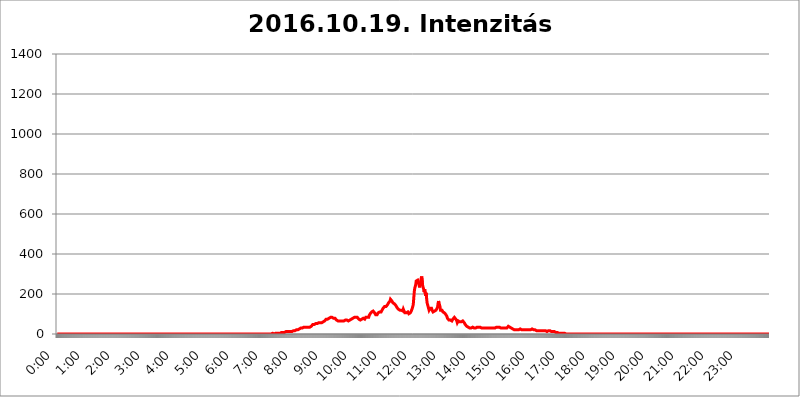
| Category | 2016.10.19. Intenzitás [W/m^2] |
|---|---|
| 0.0 | 0 |
| 0.0006944444444444445 | 0 |
| 0.001388888888888889 | 0 |
| 0.0020833333333333333 | 0 |
| 0.002777777777777778 | 0 |
| 0.003472222222222222 | 0 |
| 0.004166666666666667 | 0 |
| 0.004861111111111111 | 0 |
| 0.005555555555555556 | 0 |
| 0.0062499999999999995 | 0 |
| 0.006944444444444444 | 0 |
| 0.007638888888888889 | 0 |
| 0.008333333333333333 | 0 |
| 0.009027777777777779 | 0 |
| 0.009722222222222222 | 0 |
| 0.010416666666666666 | 0 |
| 0.011111111111111112 | 0 |
| 0.011805555555555555 | 0 |
| 0.012499999999999999 | 0 |
| 0.013194444444444444 | 0 |
| 0.013888888888888888 | 0 |
| 0.014583333333333332 | 0 |
| 0.015277777777777777 | 0 |
| 0.015972222222222224 | 0 |
| 0.016666666666666666 | 0 |
| 0.017361111111111112 | 0 |
| 0.018055555555555557 | 0 |
| 0.01875 | 0 |
| 0.019444444444444445 | 0 |
| 0.02013888888888889 | 0 |
| 0.020833333333333332 | 0 |
| 0.02152777777777778 | 0 |
| 0.022222222222222223 | 0 |
| 0.02291666666666667 | 0 |
| 0.02361111111111111 | 0 |
| 0.024305555555555556 | 0 |
| 0.024999999999999998 | 0 |
| 0.025694444444444447 | 0 |
| 0.02638888888888889 | 0 |
| 0.027083333333333334 | 0 |
| 0.027777777777777776 | 0 |
| 0.02847222222222222 | 0 |
| 0.029166666666666664 | 0 |
| 0.029861111111111113 | 0 |
| 0.030555555555555555 | 0 |
| 0.03125 | 0 |
| 0.03194444444444445 | 0 |
| 0.03263888888888889 | 0 |
| 0.03333333333333333 | 0 |
| 0.034027777777777775 | 0 |
| 0.034722222222222224 | 0 |
| 0.035416666666666666 | 0 |
| 0.036111111111111115 | 0 |
| 0.03680555555555556 | 0 |
| 0.0375 | 0 |
| 0.03819444444444444 | 0 |
| 0.03888888888888889 | 0 |
| 0.03958333333333333 | 0 |
| 0.04027777777777778 | 0 |
| 0.04097222222222222 | 0 |
| 0.041666666666666664 | 0 |
| 0.042361111111111106 | 0 |
| 0.04305555555555556 | 0 |
| 0.043750000000000004 | 0 |
| 0.044444444444444446 | 0 |
| 0.04513888888888889 | 0 |
| 0.04583333333333334 | 0 |
| 0.04652777777777778 | 0 |
| 0.04722222222222222 | 0 |
| 0.04791666666666666 | 0 |
| 0.04861111111111111 | 0 |
| 0.049305555555555554 | 0 |
| 0.049999999999999996 | 0 |
| 0.05069444444444445 | 0 |
| 0.051388888888888894 | 0 |
| 0.052083333333333336 | 0 |
| 0.05277777777777778 | 0 |
| 0.05347222222222222 | 0 |
| 0.05416666666666667 | 0 |
| 0.05486111111111111 | 0 |
| 0.05555555555555555 | 0 |
| 0.05625 | 0 |
| 0.05694444444444444 | 0 |
| 0.057638888888888885 | 0 |
| 0.05833333333333333 | 0 |
| 0.05902777777777778 | 0 |
| 0.059722222222222225 | 0 |
| 0.06041666666666667 | 0 |
| 0.061111111111111116 | 0 |
| 0.06180555555555556 | 0 |
| 0.0625 | 0 |
| 0.06319444444444444 | 0 |
| 0.06388888888888888 | 0 |
| 0.06458333333333334 | 0 |
| 0.06527777777777778 | 0 |
| 0.06597222222222222 | 0 |
| 0.06666666666666667 | 0 |
| 0.06736111111111111 | 0 |
| 0.06805555555555555 | 0 |
| 0.06874999999999999 | 0 |
| 0.06944444444444443 | 0 |
| 0.07013888888888889 | 0 |
| 0.07083333333333333 | 0 |
| 0.07152777777777779 | 0 |
| 0.07222222222222223 | 0 |
| 0.07291666666666667 | 0 |
| 0.07361111111111111 | 0 |
| 0.07430555555555556 | 0 |
| 0.075 | 0 |
| 0.07569444444444444 | 0 |
| 0.0763888888888889 | 0 |
| 0.07708333333333334 | 0 |
| 0.07777777777777778 | 0 |
| 0.07847222222222222 | 0 |
| 0.07916666666666666 | 0 |
| 0.0798611111111111 | 0 |
| 0.08055555555555556 | 0 |
| 0.08125 | 0 |
| 0.08194444444444444 | 0 |
| 0.08263888888888889 | 0 |
| 0.08333333333333333 | 0 |
| 0.08402777777777777 | 0 |
| 0.08472222222222221 | 0 |
| 0.08541666666666665 | 0 |
| 0.08611111111111112 | 0 |
| 0.08680555555555557 | 0 |
| 0.08750000000000001 | 0 |
| 0.08819444444444445 | 0 |
| 0.08888888888888889 | 0 |
| 0.08958333333333333 | 0 |
| 0.09027777777777778 | 0 |
| 0.09097222222222222 | 0 |
| 0.09166666666666667 | 0 |
| 0.09236111111111112 | 0 |
| 0.09305555555555556 | 0 |
| 0.09375 | 0 |
| 0.09444444444444444 | 0 |
| 0.09513888888888888 | 0 |
| 0.09583333333333333 | 0 |
| 0.09652777777777777 | 0 |
| 0.09722222222222222 | 0 |
| 0.09791666666666667 | 0 |
| 0.09861111111111111 | 0 |
| 0.09930555555555555 | 0 |
| 0.09999999999999999 | 0 |
| 0.10069444444444443 | 0 |
| 0.1013888888888889 | 0 |
| 0.10208333333333335 | 0 |
| 0.10277777777777779 | 0 |
| 0.10347222222222223 | 0 |
| 0.10416666666666667 | 0 |
| 0.10486111111111111 | 0 |
| 0.10555555555555556 | 0 |
| 0.10625 | 0 |
| 0.10694444444444444 | 0 |
| 0.1076388888888889 | 0 |
| 0.10833333333333334 | 0 |
| 0.10902777777777778 | 0 |
| 0.10972222222222222 | 0 |
| 0.1111111111111111 | 0 |
| 0.11180555555555556 | 0 |
| 0.11180555555555556 | 0 |
| 0.1125 | 0 |
| 0.11319444444444444 | 0 |
| 0.11388888888888889 | 0 |
| 0.11458333333333333 | 0 |
| 0.11527777777777777 | 0 |
| 0.11597222222222221 | 0 |
| 0.11666666666666665 | 0 |
| 0.1173611111111111 | 0 |
| 0.11805555555555557 | 0 |
| 0.11944444444444445 | 0 |
| 0.12013888888888889 | 0 |
| 0.12083333333333333 | 0 |
| 0.12152777777777778 | 0 |
| 0.12222222222222223 | 0 |
| 0.12291666666666667 | 0 |
| 0.12291666666666667 | 0 |
| 0.12361111111111112 | 0 |
| 0.12430555555555556 | 0 |
| 0.125 | 0 |
| 0.12569444444444444 | 0 |
| 0.12638888888888888 | 0 |
| 0.12708333333333333 | 0 |
| 0.16875 | 0 |
| 0.12847222222222224 | 0 |
| 0.12916666666666668 | 0 |
| 0.12986111111111112 | 0 |
| 0.13055555555555556 | 0 |
| 0.13125 | 0 |
| 0.13194444444444445 | 0 |
| 0.1326388888888889 | 0 |
| 0.13333333333333333 | 0 |
| 0.13402777777777777 | 0 |
| 0.13402777777777777 | 0 |
| 0.13472222222222222 | 0 |
| 0.13541666666666666 | 0 |
| 0.1361111111111111 | 0 |
| 0.13749999999999998 | 0 |
| 0.13819444444444443 | 0 |
| 0.1388888888888889 | 0 |
| 0.13958333333333334 | 0 |
| 0.14027777777777778 | 0 |
| 0.14097222222222222 | 0 |
| 0.14166666666666666 | 0 |
| 0.1423611111111111 | 0 |
| 0.14305555555555557 | 0 |
| 0.14375000000000002 | 0 |
| 0.14444444444444446 | 0 |
| 0.1451388888888889 | 0 |
| 0.1451388888888889 | 0 |
| 0.14652777777777778 | 0 |
| 0.14722222222222223 | 0 |
| 0.14791666666666667 | 0 |
| 0.1486111111111111 | 0 |
| 0.14930555555555555 | 0 |
| 0.15 | 0 |
| 0.15069444444444444 | 0 |
| 0.15138888888888888 | 0 |
| 0.15208333333333332 | 0 |
| 0.15277777777777776 | 0 |
| 0.15347222222222223 | 0 |
| 0.15416666666666667 | 0 |
| 0.15486111111111112 | 0 |
| 0.15555555555555556 | 0 |
| 0.15625 | 0 |
| 0.15694444444444444 | 0 |
| 0.15763888888888888 | 0 |
| 0.15833333333333333 | 0 |
| 0.15902777777777777 | 0 |
| 0.15972222222222224 | 0 |
| 0.16041666666666668 | 0 |
| 0.16111111111111112 | 0 |
| 0.16180555555555556 | 0 |
| 0.1625 | 0 |
| 0.16319444444444445 | 0 |
| 0.1638888888888889 | 0 |
| 0.16458333333333333 | 0 |
| 0.16527777777777777 | 0 |
| 0.16597222222222222 | 0 |
| 0.16666666666666666 | 0 |
| 0.1673611111111111 | 0 |
| 0.16805555555555554 | 0 |
| 0.16874999999999998 | 0 |
| 0.16944444444444443 | 0 |
| 0.17013888888888887 | 0 |
| 0.1708333333333333 | 0 |
| 0.17152777777777775 | 0 |
| 0.17222222222222225 | 0 |
| 0.1729166666666667 | 0 |
| 0.17361111111111113 | 0 |
| 0.17430555555555557 | 0 |
| 0.17500000000000002 | 0 |
| 0.17569444444444446 | 0 |
| 0.1763888888888889 | 0 |
| 0.17708333333333334 | 0 |
| 0.17777777777777778 | 0 |
| 0.17847222222222223 | 0 |
| 0.17916666666666667 | 0 |
| 0.1798611111111111 | 0 |
| 0.18055555555555555 | 0 |
| 0.18125 | 0 |
| 0.18194444444444444 | 0 |
| 0.1826388888888889 | 0 |
| 0.18333333333333335 | 0 |
| 0.1840277777777778 | 0 |
| 0.18472222222222223 | 0 |
| 0.18541666666666667 | 0 |
| 0.18611111111111112 | 0 |
| 0.18680555555555556 | 0 |
| 0.1875 | 0 |
| 0.18819444444444444 | 0 |
| 0.18888888888888888 | 0 |
| 0.18958333333333333 | 0 |
| 0.19027777777777777 | 0 |
| 0.1909722222222222 | 0 |
| 0.19166666666666665 | 0 |
| 0.19236111111111112 | 0 |
| 0.19305555555555554 | 0 |
| 0.19375 | 0 |
| 0.19444444444444445 | 0 |
| 0.1951388888888889 | 0 |
| 0.19583333333333333 | 0 |
| 0.19652777777777777 | 0 |
| 0.19722222222222222 | 0 |
| 0.19791666666666666 | 0 |
| 0.1986111111111111 | 0 |
| 0.19930555555555554 | 0 |
| 0.19999999999999998 | 0 |
| 0.20069444444444443 | 0 |
| 0.20138888888888887 | 0 |
| 0.2020833333333333 | 0 |
| 0.2027777777777778 | 0 |
| 0.2034722222222222 | 0 |
| 0.2041666666666667 | 0 |
| 0.20486111111111113 | 0 |
| 0.20555555555555557 | 0 |
| 0.20625000000000002 | 0 |
| 0.20694444444444446 | 0 |
| 0.2076388888888889 | 0 |
| 0.20833333333333334 | 0 |
| 0.20902777777777778 | 0 |
| 0.20972222222222223 | 0 |
| 0.21041666666666667 | 0 |
| 0.2111111111111111 | 0 |
| 0.21180555555555555 | 0 |
| 0.2125 | 0 |
| 0.21319444444444444 | 0 |
| 0.2138888888888889 | 0 |
| 0.21458333333333335 | 0 |
| 0.2152777777777778 | 0 |
| 0.21597222222222223 | 0 |
| 0.21666666666666667 | 0 |
| 0.21736111111111112 | 0 |
| 0.21805555555555556 | 0 |
| 0.21875 | 0 |
| 0.21944444444444444 | 0 |
| 0.22013888888888888 | 0 |
| 0.22083333333333333 | 0 |
| 0.22152777777777777 | 0 |
| 0.2222222222222222 | 0 |
| 0.22291666666666665 | 0 |
| 0.2236111111111111 | 0 |
| 0.22430555555555556 | 0 |
| 0.225 | 0 |
| 0.22569444444444445 | 0 |
| 0.2263888888888889 | 0 |
| 0.22708333333333333 | 0 |
| 0.22777777777777777 | 0 |
| 0.22847222222222222 | 0 |
| 0.22916666666666666 | 0 |
| 0.2298611111111111 | 0 |
| 0.23055555555555554 | 0 |
| 0.23124999999999998 | 0 |
| 0.23194444444444443 | 0 |
| 0.23263888888888887 | 0 |
| 0.2333333333333333 | 0 |
| 0.2340277777777778 | 0 |
| 0.2347222222222222 | 0 |
| 0.2354166666666667 | 0 |
| 0.23611111111111113 | 0 |
| 0.23680555555555557 | 0 |
| 0.23750000000000002 | 0 |
| 0.23819444444444446 | 0 |
| 0.2388888888888889 | 0 |
| 0.23958333333333334 | 0 |
| 0.24027777777777778 | 0 |
| 0.24097222222222223 | 0 |
| 0.24166666666666667 | 0 |
| 0.2423611111111111 | 0 |
| 0.24305555555555555 | 0 |
| 0.24375 | 0 |
| 0.24444444444444446 | 0 |
| 0.24513888888888888 | 0 |
| 0.24583333333333335 | 0 |
| 0.2465277777777778 | 0 |
| 0.24722222222222223 | 0 |
| 0.24791666666666667 | 0 |
| 0.24861111111111112 | 0 |
| 0.24930555555555556 | 0 |
| 0.25 | 0 |
| 0.25069444444444444 | 0 |
| 0.2513888888888889 | 0 |
| 0.2520833333333333 | 0 |
| 0.25277777777777777 | 0 |
| 0.2534722222222222 | 0 |
| 0.25416666666666665 | 0 |
| 0.2548611111111111 | 0 |
| 0.2555555555555556 | 0 |
| 0.25625000000000003 | 0 |
| 0.2569444444444445 | 0 |
| 0.2576388888888889 | 0 |
| 0.25833333333333336 | 0 |
| 0.2590277777777778 | 0 |
| 0.25972222222222224 | 0 |
| 0.2604166666666667 | 0 |
| 0.2611111111111111 | 0 |
| 0.26180555555555557 | 0 |
| 0.2625 | 0 |
| 0.26319444444444445 | 0 |
| 0.2638888888888889 | 0 |
| 0.26458333333333334 | 0 |
| 0.2652777777777778 | 0 |
| 0.2659722222222222 | 0 |
| 0.26666666666666666 | 0 |
| 0.2673611111111111 | 0 |
| 0.26805555555555555 | 0 |
| 0.26875 | 0 |
| 0.26944444444444443 | 0 |
| 0.2701388888888889 | 0 |
| 0.2708333333333333 | 0 |
| 0.27152777777777776 | 0 |
| 0.2722222222222222 | 0 |
| 0.27291666666666664 | 0 |
| 0.2736111111111111 | 0 |
| 0.2743055555555555 | 0 |
| 0.27499999999999997 | 0 |
| 0.27569444444444446 | 0 |
| 0.27638888888888885 | 0 |
| 0.27708333333333335 | 0 |
| 0.2777777777777778 | 0 |
| 0.27847222222222223 | 0 |
| 0.2791666666666667 | 0 |
| 0.2798611111111111 | 0 |
| 0.28055555555555556 | 0 |
| 0.28125 | 0 |
| 0.28194444444444444 | 0 |
| 0.2826388888888889 | 0 |
| 0.2833333333333333 | 0 |
| 0.28402777777777777 | 0 |
| 0.2847222222222222 | 0 |
| 0.28541666666666665 | 0 |
| 0.28611111111111115 | 0 |
| 0.28680555555555554 | 0 |
| 0.28750000000000003 | 0 |
| 0.2881944444444445 | 0 |
| 0.2888888888888889 | 0 |
| 0.28958333333333336 | 0 |
| 0.2902777777777778 | 0 |
| 0.29097222222222224 | 0 |
| 0.2916666666666667 | 0 |
| 0.2923611111111111 | 0 |
| 0.29305555555555557 | 0 |
| 0.29375 | 0 |
| 0.29444444444444445 | 0 |
| 0.2951388888888889 | 0 |
| 0.29583333333333334 | 0 |
| 0.2965277777777778 | 0 |
| 0.2972222222222222 | 0 |
| 0.29791666666666666 | 0 |
| 0.2986111111111111 | 0 |
| 0.29930555555555555 | 0 |
| 0.3 | 0 |
| 0.30069444444444443 | 0 |
| 0.3013888888888889 | 3.525 |
| 0.3020833333333333 | 3.525 |
| 0.30277777777777776 | 3.525 |
| 0.3034722222222222 | 0 |
| 0.30416666666666664 | 0 |
| 0.3048611111111111 | 3.525 |
| 0.3055555555555555 | 3.525 |
| 0.30624999999999997 | 3.525 |
| 0.3069444444444444 | 3.525 |
| 0.3076388888888889 | 3.525 |
| 0.30833333333333335 | 3.525 |
| 0.3090277777777778 | 3.525 |
| 0.30972222222222223 | 3.525 |
| 0.3104166666666667 | 3.525 |
| 0.3111111111111111 | 3.525 |
| 0.31180555555555556 | 3.525 |
| 0.3125 | 3.525 |
| 0.31319444444444444 | 3.525 |
| 0.3138888888888889 | 3.525 |
| 0.3145833333333333 | 7.887 |
| 0.31527777777777777 | 7.887 |
| 0.3159722222222222 | 7.887 |
| 0.31666666666666665 | 7.887 |
| 0.31736111111111115 | 7.887 |
| 0.31805555555555554 | 7.887 |
| 0.31875000000000003 | 7.887 |
| 0.3194444444444445 | 7.887 |
| 0.3201388888888889 | 12.257 |
| 0.32083333333333336 | 12.257 |
| 0.3215277777777778 | 12.257 |
| 0.32222222222222224 | 12.257 |
| 0.3229166666666667 | 12.257 |
| 0.3236111111111111 | 12.257 |
| 0.32430555555555557 | 12.257 |
| 0.325 | 12.257 |
| 0.32569444444444445 | 12.257 |
| 0.3263888888888889 | 12.257 |
| 0.32708333333333334 | 12.257 |
| 0.3277777777777778 | 12.257 |
| 0.3284722222222222 | 12.257 |
| 0.32916666666666666 | 12.257 |
| 0.3298611111111111 | 12.257 |
| 0.33055555555555555 | 16.636 |
| 0.33125 | 16.636 |
| 0.33194444444444443 | 16.636 |
| 0.3326388888888889 | 16.636 |
| 0.3333333333333333 | 16.636 |
| 0.3340277777777778 | 16.636 |
| 0.3347222222222222 | 21.024 |
| 0.3354166666666667 | 21.024 |
| 0.3361111111111111 | 21.024 |
| 0.3368055555555556 | 21.024 |
| 0.33749999999999997 | 21.024 |
| 0.33819444444444446 | 25.419 |
| 0.33888888888888885 | 25.419 |
| 0.33958333333333335 | 25.419 |
| 0.34027777777777773 | 25.419 |
| 0.34097222222222223 | 25.419 |
| 0.3416666666666666 | 29.823 |
| 0.3423611111111111 | 29.823 |
| 0.3430555555555555 | 29.823 |
| 0.34375 | 29.823 |
| 0.3444444444444445 | 29.823 |
| 0.3451388888888889 | 34.234 |
| 0.3458333333333334 | 34.234 |
| 0.34652777777777777 | 34.234 |
| 0.34722222222222227 | 34.234 |
| 0.34791666666666665 | 34.234 |
| 0.34861111111111115 | 34.234 |
| 0.34930555555555554 | 34.234 |
| 0.35000000000000003 | 34.234 |
| 0.3506944444444444 | 34.234 |
| 0.3513888888888889 | 34.234 |
| 0.3520833333333333 | 34.234 |
| 0.3527777777777778 | 34.234 |
| 0.3534722222222222 | 34.234 |
| 0.3541666666666667 | 34.234 |
| 0.3548611111111111 | 34.234 |
| 0.35555555555555557 | 38.653 |
| 0.35625 | 38.653 |
| 0.35694444444444445 | 43.079 |
| 0.3576388888888889 | 43.079 |
| 0.35833333333333334 | 47.511 |
| 0.3590277777777778 | 47.511 |
| 0.3597222222222222 | 47.511 |
| 0.36041666666666666 | 47.511 |
| 0.3611111111111111 | 47.511 |
| 0.36180555555555555 | 51.951 |
| 0.3625 | 51.951 |
| 0.36319444444444443 | 51.951 |
| 0.3638888888888889 | 51.951 |
| 0.3645833333333333 | 51.951 |
| 0.3652777777777778 | 51.951 |
| 0.3659722222222222 | 56.398 |
| 0.3666666666666667 | 56.398 |
| 0.3673611111111111 | 56.398 |
| 0.3680555555555556 | 56.398 |
| 0.36874999999999997 | 56.398 |
| 0.36944444444444446 | 56.398 |
| 0.37013888888888885 | 56.398 |
| 0.37083333333333335 | 56.398 |
| 0.37152777777777773 | 56.398 |
| 0.37222222222222223 | 56.398 |
| 0.3729166666666666 | 60.85 |
| 0.3736111111111111 | 60.85 |
| 0.3743055555555555 | 65.31 |
| 0.375 | 65.31 |
| 0.3756944444444445 | 69.775 |
| 0.3763888888888889 | 69.775 |
| 0.3770833333333334 | 74.246 |
| 0.37777777777777777 | 74.246 |
| 0.37847222222222227 | 74.246 |
| 0.37916666666666665 | 74.246 |
| 0.37986111111111115 | 74.246 |
| 0.38055555555555554 | 78.722 |
| 0.38125000000000003 | 78.722 |
| 0.3819444444444444 | 78.722 |
| 0.3826388888888889 | 78.722 |
| 0.3833333333333333 | 83.205 |
| 0.3840277777777778 | 83.205 |
| 0.3847222222222222 | 83.205 |
| 0.3854166666666667 | 83.205 |
| 0.3861111111111111 | 83.205 |
| 0.38680555555555557 | 83.205 |
| 0.3875 | 78.722 |
| 0.38819444444444445 | 78.722 |
| 0.3888888888888889 | 78.722 |
| 0.38958333333333334 | 78.722 |
| 0.3902777777777778 | 74.246 |
| 0.3909722222222222 | 74.246 |
| 0.39166666666666666 | 69.775 |
| 0.3923611111111111 | 69.775 |
| 0.39305555555555555 | 65.31 |
| 0.39375 | 65.31 |
| 0.39444444444444443 | 65.31 |
| 0.3951388888888889 | 65.31 |
| 0.3958333333333333 | 65.31 |
| 0.3965277777777778 | 65.31 |
| 0.3972222222222222 | 65.31 |
| 0.3979166666666667 | 65.31 |
| 0.3986111111111111 | 65.31 |
| 0.3993055555555556 | 65.31 |
| 0.39999999999999997 | 65.31 |
| 0.40069444444444446 | 65.31 |
| 0.40138888888888885 | 65.31 |
| 0.40208333333333335 | 65.31 |
| 0.40277777777777773 | 65.31 |
| 0.40347222222222223 | 65.31 |
| 0.4041666666666666 | 69.775 |
| 0.4048611111111111 | 69.775 |
| 0.4055555555555555 | 69.775 |
| 0.40625 | 69.775 |
| 0.4069444444444445 | 65.31 |
| 0.4076388888888889 | 65.31 |
| 0.4083333333333334 | 65.31 |
| 0.40902777777777777 | 65.31 |
| 0.40972222222222227 | 65.31 |
| 0.41041666666666665 | 69.775 |
| 0.41111111111111115 | 69.775 |
| 0.41180555555555554 | 74.246 |
| 0.41250000000000003 | 74.246 |
| 0.4131944444444444 | 74.246 |
| 0.4138888888888889 | 78.722 |
| 0.4145833333333333 | 78.722 |
| 0.4152777777777778 | 78.722 |
| 0.4159722222222222 | 78.722 |
| 0.4166666666666667 | 83.205 |
| 0.4173611111111111 | 83.205 |
| 0.41805555555555557 | 83.205 |
| 0.41875 | 83.205 |
| 0.41944444444444445 | 83.205 |
| 0.4201388888888889 | 83.205 |
| 0.42083333333333334 | 83.205 |
| 0.4215277777777778 | 78.722 |
| 0.4222222222222222 | 78.722 |
| 0.42291666666666666 | 74.246 |
| 0.4236111111111111 | 69.775 |
| 0.42430555555555555 | 69.775 |
| 0.425 | 69.775 |
| 0.42569444444444443 | 74.246 |
| 0.4263888888888889 | 74.246 |
| 0.4270833333333333 | 74.246 |
| 0.4277777777777778 | 74.246 |
| 0.4284722222222222 | 74.246 |
| 0.4291666666666667 | 78.722 |
| 0.4298611111111111 | 78.722 |
| 0.4305555555555556 | 74.246 |
| 0.43124999999999997 | 74.246 |
| 0.43194444444444446 | 78.722 |
| 0.43263888888888885 | 83.205 |
| 0.43333333333333335 | 87.692 |
| 0.43402777777777773 | 87.692 |
| 0.43472222222222223 | 83.205 |
| 0.4354166666666666 | 83.205 |
| 0.4361111111111111 | 83.205 |
| 0.4368055555555555 | 83.205 |
| 0.4375 | 92.184 |
| 0.4381944444444445 | 96.682 |
| 0.4388888888888889 | 101.184 |
| 0.4395833333333334 | 101.184 |
| 0.44027777777777777 | 105.69 |
| 0.44097222222222227 | 110.201 |
| 0.44166666666666665 | 110.201 |
| 0.44236111111111115 | 110.201 |
| 0.44305555555555554 | 114.716 |
| 0.44375000000000003 | 114.716 |
| 0.4444444444444444 | 110.201 |
| 0.4451388888888889 | 105.69 |
| 0.4458333333333333 | 101.184 |
| 0.4465277777777778 | 96.682 |
| 0.4472222222222222 | 96.682 |
| 0.4479166666666667 | 96.682 |
| 0.4486111111111111 | 96.682 |
| 0.44930555555555557 | 101.184 |
| 0.45 | 105.69 |
| 0.45069444444444445 | 110.201 |
| 0.4513888888888889 | 110.201 |
| 0.45208333333333334 | 110.201 |
| 0.4527777777777778 | 105.69 |
| 0.4534722222222222 | 105.69 |
| 0.45416666666666666 | 110.201 |
| 0.4548611111111111 | 114.716 |
| 0.45555555555555555 | 119.235 |
| 0.45625 | 123.758 |
| 0.45694444444444443 | 128.284 |
| 0.4576388888888889 | 132.814 |
| 0.4583333333333333 | 132.814 |
| 0.4590277777777778 | 137.347 |
| 0.4597222222222222 | 137.347 |
| 0.4604166666666667 | 137.347 |
| 0.4611111111111111 | 137.347 |
| 0.4618055555555556 | 137.347 |
| 0.46249999999999997 | 141.884 |
| 0.46319444444444446 | 146.423 |
| 0.46388888888888885 | 150.964 |
| 0.46458333333333335 | 155.509 |
| 0.46527777777777773 | 155.509 |
| 0.46597222222222223 | 160.056 |
| 0.4666666666666666 | 164.605 |
| 0.4673611111111111 | 173.709 |
| 0.4680555555555555 | 173.709 |
| 0.46875 | 173.709 |
| 0.4694444444444445 | 164.605 |
| 0.4701388888888889 | 160.056 |
| 0.4708333333333334 | 155.509 |
| 0.47152777777777777 | 155.509 |
| 0.47222222222222227 | 155.509 |
| 0.47291666666666665 | 150.964 |
| 0.47361111111111115 | 150.964 |
| 0.47430555555555554 | 146.423 |
| 0.47500000000000003 | 141.884 |
| 0.4756944444444444 | 137.347 |
| 0.4763888888888889 | 132.814 |
| 0.4770833333333333 | 128.284 |
| 0.4777777777777778 | 128.284 |
| 0.4784722222222222 | 123.758 |
| 0.4791666666666667 | 123.758 |
| 0.4798611111111111 | 119.235 |
| 0.48055555555555557 | 119.235 |
| 0.48125 | 123.758 |
| 0.48194444444444445 | 123.758 |
| 0.4826388888888889 | 119.235 |
| 0.48333333333333334 | 119.235 |
| 0.4840277777777778 | 119.235 |
| 0.4847222222222222 | 114.716 |
| 0.48541666666666666 | 123.758 |
| 0.4861111111111111 | 123.758 |
| 0.48680555555555555 | 119.235 |
| 0.4875 | 105.69 |
| 0.48819444444444443 | 101.184 |
| 0.4888888888888889 | 105.69 |
| 0.4895833333333333 | 105.69 |
| 0.4902777777777778 | 105.69 |
| 0.4909722222222222 | 110.201 |
| 0.4916666666666667 | 110.201 |
| 0.4923611111111111 | 105.69 |
| 0.4930555555555556 | 101.184 |
| 0.49374999999999997 | 101.184 |
| 0.49444444444444446 | 105.69 |
| 0.49513888888888885 | 105.69 |
| 0.49583333333333335 | 110.201 |
| 0.49652777777777773 | 114.716 |
| 0.49722222222222223 | 119.235 |
| 0.4979166666666666 | 128.284 |
| 0.4986111111111111 | 132.814 |
| 0.4993055555555555 | 146.423 |
| 0.5 | 178.264 |
| 0.5006944444444444 | 210.182 |
| 0.5013888888888889 | 228.436 |
| 0.5020833333333333 | 237.564 |
| 0.5027777777777778 | 246.689 |
| 0.5034722222222222 | 264.932 |
| 0.5041666666666667 | 269.49 |
| 0.5048611111111111 | 269.49 |
| 0.5055555555555555 | 269.49 |
| 0.50625 | 264.932 |
| 0.5069444444444444 | 255.813 |
| 0.5076388888888889 | 242.127 |
| 0.5083333333333333 | 233 |
| 0.5090277777777777 | 251.251 |
| 0.5097222222222222 | 260.373 |
| 0.5104166666666666 | 278.603 |
| 0.5111111111111112 | 287.709 |
| 0.5118055555555555 | 287.709 |
| 0.5125000000000001 | 242.127 |
| 0.5131944444444444 | 233 |
| 0.513888888888889 | 223.873 |
| 0.5145833333333333 | 210.182 |
| 0.5152777777777778 | 223.873 |
| 0.5159722222222222 | 219.309 |
| 0.5166666666666667 | 191.937 |
| 0.517361111111111 | 205.62 |
| 0.5180555555555556 | 178.264 |
| 0.5187499999999999 | 155.509 |
| 0.5194444444444445 | 155.509 |
| 0.5201388888888888 | 137.347 |
| 0.5208333333333334 | 128.284 |
| 0.5215277777777778 | 119.235 |
| 0.5222222222222223 | 119.235 |
| 0.5229166666666667 | 128.284 |
| 0.5236111111111111 | 128.284 |
| 0.5243055555555556 | 128.284 |
| 0.525 | 128.284 |
| 0.5256944444444445 | 119.235 |
| 0.5263888888888889 | 114.716 |
| 0.5270833333333333 | 110.201 |
| 0.5277777777777778 | 110.201 |
| 0.5284722222222222 | 110.201 |
| 0.5291666666666667 | 114.716 |
| 0.5298611111111111 | 114.716 |
| 0.5305555555555556 | 119.235 |
| 0.53125 | 119.235 |
| 0.5319444444444444 | 119.235 |
| 0.5326388888888889 | 123.758 |
| 0.5333333333333333 | 132.814 |
| 0.5340277777777778 | 150.964 |
| 0.5347222222222222 | 164.605 |
| 0.5354166666666667 | 155.509 |
| 0.5361111111111111 | 146.423 |
| 0.5368055555555555 | 137.347 |
| 0.5375 | 119.235 |
| 0.5381944444444444 | 114.716 |
| 0.5388888888888889 | 119.235 |
| 0.5395833333333333 | 119.235 |
| 0.5402777777777777 | 114.716 |
| 0.5409722222222222 | 110.201 |
| 0.5416666666666666 | 105.69 |
| 0.5423611111111112 | 105.69 |
| 0.5430555555555555 | 105.69 |
| 0.5437500000000001 | 110.201 |
| 0.5444444444444444 | 105.69 |
| 0.545138888888889 | 96.682 |
| 0.5458333333333333 | 92.184 |
| 0.5465277777777778 | 87.692 |
| 0.5472222222222222 | 78.722 |
| 0.5479166666666667 | 74.246 |
| 0.548611111111111 | 74.246 |
| 0.5493055555555556 | 69.775 |
| 0.5499999999999999 | 69.775 |
| 0.5506944444444445 | 65.31 |
| 0.5513888888888888 | 69.775 |
| 0.5520833333333334 | 65.31 |
| 0.5527777777777778 | 65.31 |
| 0.5534722222222223 | 65.31 |
| 0.5541666666666667 | 69.775 |
| 0.5548611111111111 | 74.246 |
| 0.5555555555555556 | 74.246 |
| 0.55625 | 78.722 |
| 0.5569444444444445 | 83.205 |
| 0.5576388888888889 | 83.205 |
| 0.5583333333333333 | 78.722 |
| 0.5590277777777778 | 74.246 |
| 0.5597222222222222 | 69.775 |
| 0.5604166666666667 | 65.31 |
| 0.5611111111111111 | 56.398 |
| 0.5618055555555556 | 60.85 |
| 0.5625 | 65.31 |
| 0.5631944444444444 | 65.31 |
| 0.5638888888888889 | 65.31 |
| 0.5645833333333333 | 60.85 |
| 0.5652777777777778 | 65.31 |
| 0.5659722222222222 | 65.31 |
| 0.5666666666666667 | 60.85 |
| 0.5673611111111111 | 60.85 |
| 0.5680555555555555 | 60.85 |
| 0.56875 | 65.31 |
| 0.5694444444444444 | 65.31 |
| 0.5701388888888889 | 60.85 |
| 0.5708333333333333 | 56.398 |
| 0.5715277777777777 | 51.951 |
| 0.5722222222222222 | 47.511 |
| 0.5729166666666666 | 47.511 |
| 0.5736111111111112 | 43.079 |
| 0.5743055555555555 | 38.653 |
| 0.5750000000000001 | 38.653 |
| 0.5756944444444444 | 38.653 |
| 0.576388888888889 | 34.234 |
| 0.5770833333333333 | 34.234 |
| 0.5777777777777778 | 34.234 |
| 0.5784722222222222 | 29.823 |
| 0.5791666666666667 | 29.823 |
| 0.579861111111111 | 29.823 |
| 0.5805555555555556 | 29.823 |
| 0.5812499999999999 | 34.234 |
| 0.5819444444444445 | 34.234 |
| 0.5826388888888888 | 34.234 |
| 0.5833333333333334 | 29.823 |
| 0.5840277777777778 | 29.823 |
| 0.5847222222222223 | 29.823 |
| 0.5854166666666667 | 29.823 |
| 0.5861111111111111 | 29.823 |
| 0.5868055555555556 | 29.823 |
| 0.5875 | 34.234 |
| 0.5881944444444445 | 34.234 |
| 0.5888888888888889 | 34.234 |
| 0.5895833333333333 | 34.234 |
| 0.5902777777777778 | 34.234 |
| 0.5909722222222222 | 34.234 |
| 0.5916666666666667 | 34.234 |
| 0.5923611111111111 | 34.234 |
| 0.5930555555555556 | 34.234 |
| 0.59375 | 29.823 |
| 0.5944444444444444 | 29.823 |
| 0.5951388888888889 | 29.823 |
| 0.5958333333333333 | 29.823 |
| 0.5965277777777778 | 29.823 |
| 0.5972222222222222 | 29.823 |
| 0.5979166666666667 | 29.823 |
| 0.5986111111111111 | 29.823 |
| 0.5993055555555555 | 29.823 |
| 0.6 | 29.823 |
| 0.6006944444444444 | 29.823 |
| 0.6013888888888889 | 29.823 |
| 0.6020833333333333 | 29.823 |
| 0.6027777777777777 | 29.823 |
| 0.6034722222222222 | 29.823 |
| 0.6041666666666666 | 29.823 |
| 0.6048611111111112 | 29.823 |
| 0.6055555555555555 | 29.823 |
| 0.6062500000000001 | 29.823 |
| 0.6069444444444444 | 29.823 |
| 0.607638888888889 | 29.823 |
| 0.6083333333333333 | 29.823 |
| 0.6090277777777778 | 29.823 |
| 0.6097222222222222 | 29.823 |
| 0.6104166666666667 | 29.823 |
| 0.611111111111111 | 29.823 |
| 0.6118055555555556 | 29.823 |
| 0.6124999999999999 | 29.823 |
| 0.6131944444444445 | 29.823 |
| 0.6138888888888888 | 29.823 |
| 0.6145833333333334 | 29.823 |
| 0.6152777777777778 | 29.823 |
| 0.6159722222222223 | 34.234 |
| 0.6166666666666667 | 34.234 |
| 0.6173611111111111 | 34.234 |
| 0.6180555555555556 | 34.234 |
| 0.61875 | 34.234 |
| 0.6194444444444445 | 34.234 |
| 0.6201388888888889 | 34.234 |
| 0.6208333333333333 | 34.234 |
| 0.6215277777777778 | 34.234 |
| 0.6222222222222222 | 29.823 |
| 0.6229166666666667 | 29.823 |
| 0.6236111111111111 | 29.823 |
| 0.6243055555555556 | 29.823 |
| 0.625 | 29.823 |
| 0.6256944444444444 | 29.823 |
| 0.6263888888888889 | 29.823 |
| 0.6270833333333333 | 29.823 |
| 0.6277777777777778 | 29.823 |
| 0.6284722222222222 | 29.823 |
| 0.6291666666666667 | 29.823 |
| 0.6298611111111111 | 29.823 |
| 0.6305555555555555 | 29.823 |
| 0.63125 | 34.234 |
| 0.6319444444444444 | 34.234 |
| 0.6326388888888889 | 38.653 |
| 0.6333333333333333 | 38.653 |
| 0.6340277777777777 | 38.653 |
| 0.6347222222222222 | 34.234 |
| 0.6354166666666666 | 34.234 |
| 0.6361111111111112 | 29.823 |
| 0.6368055555555555 | 29.823 |
| 0.6375000000000001 | 29.823 |
| 0.6381944444444444 | 25.419 |
| 0.638888888888889 | 25.419 |
| 0.6395833333333333 | 25.419 |
| 0.6402777777777778 | 21.024 |
| 0.6409722222222222 | 21.024 |
| 0.6416666666666667 | 21.024 |
| 0.642361111111111 | 16.636 |
| 0.6430555555555556 | 21.024 |
| 0.6437499999999999 | 21.024 |
| 0.6444444444444445 | 21.024 |
| 0.6451388888888888 | 21.024 |
| 0.6458333333333334 | 21.024 |
| 0.6465277777777778 | 21.024 |
| 0.6472222222222223 | 21.024 |
| 0.6479166666666667 | 21.024 |
| 0.6486111111111111 | 21.024 |
| 0.6493055555555556 | 25.419 |
| 0.65 | 25.419 |
| 0.6506944444444445 | 25.419 |
| 0.6513888888888889 | 21.024 |
| 0.6520833333333333 | 21.024 |
| 0.6527777777777778 | 21.024 |
| 0.6534722222222222 | 21.024 |
| 0.6541666666666667 | 21.024 |
| 0.6548611111111111 | 21.024 |
| 0.6555555555555556 | 21.024 |
| 0.65625 | 21.024 |
| 0.6569444444444444 | 21.024 |
| 0.6576388888888889 | 21.024 |
| 0.6583333333333333 | 21.024 |
| 0.6590277777777778 | 21.024 |
| 0.6597222222222222 | 21.024 |
| 0.6604166666666667 | 21.024 |
| 0.6611111111111111 | 21.024 |
| 0.6618055555555555 | 21.024 |
| 0.6625 | 21.024 |
| 0.6631944444444444 | 21.024 |
| 0.6638888888888889 | 21.024 |
| 0.6645833333333333 | 25.419 |
| 0.6652777777777777 | 25.419 |
| 0.6659722222222222 | 25.419 |
| 0.6666666666666666 | 25.419 |
| 0.6673611111111111 | 21.024 |
| 0.6680555555555556 | 21.024 |
| 0.6687500000000001 | 21.024 |
| 0.6694444444444444 | 21.024 |
| 0.6701388888888888 | 21.024 |
| 0.6708333333333334 | 21.024 |
| 0.6715277777777778 | 16.636 |
| 0.6722222222222222 | 16.636 |
| 0.6729166666666666 | 16.636 |
| 0.6736111111111112 | 16.636 |
| 0.6743055555555556 | 16.636 |
| 0.6749999999999999 | 16.636 |
| 0.6756944444444444 | 16.636 |
| 0.6763888888888889 | 16.636 |
| 0.6770833333333334 | 16.636 |
| 0.6777777777777777 | 16.636 |
| 0.6784722222222223 | 16.636 |
| 0.6791666666666667 | 16.636 |
| 0.6798611111111111 | 16.636 |
| 0.6805555555555555 | 16.636 |
| 0.68125 | 16.636 |
| 0.6819444444444445 | 16.636 |
| 0.6826388888888889 | 16.636 |
| 0.6833333333333332 | 16.636 |
| 0.6840277777777778 | 16.636 |
| 0.6847222222222222 | 16.636 |
| 0.6854166666666667 | 16.636 |
| 0.686111111111111 | 12.257 |
| 0.6868055555555556 | 12.257 |
| 0.6875 | 12.257 |
| 0.6881944444444444 | 12.257 |
| 0.688888888888889 | 16.636 |
| 0.6895833333333333 | 16.636 |
| 0.6902777777777778 | 16.636 |
| 0.6909722222222222 | 16.636 |
| 0.6916666666666668 | 12.257 |
| 0.6923611111111111 | 12.257 |
| 0.6930555555555555 | 12.257 |
| 0.69375 | 12.257 |
| 0.6944444444444445 | 12.257 |
| 0.6951388888888889 | 12.257 |
| 0.6958333333333333 | 12.257 |
| 0.6965277777777777 | 12.257 |
| 0.6972222222222223 | 12.257 |
| 0.6979166666666666 | 12.257 |
| 0.6986111111111111 | 7.887 |
| 0.6993055555555556 | 7.887 |
| 0.7000000000000001 | 7.887 |
| 0.7006944444444444 | 7.887 |
| 0.7013888888888888 | 7.887 |
| 0.7020833333333334 | 7.887 |
| 0.7027777777777778 | 7.887 |
| 0.7034722222222222 | 3.525 |
| 0.7041666666666666 | 3.525 |
| 0.7048611111111112 | 3.525 |
| 0.7055555555555556 | 3.525 |
| 0.7062499999999999 | 3.525 |
| 0.7069444444444444 | 3.525 |
| 0.7076388888888889 | 3.525 |
| 0.7083333333333334 | 3.525 |
| 0.7090277777777777 | 3.525 |
| 0.7097222222222223 | 3.525 |
| 0.7104166666666667 | 3.525 |
| 0.7111111111111111 | 3.525 |
| 0.7118055555555555 | 3.525 |
| 0.7125 | 0 |
| 0.7131944444444445 | 0 |
| 0.7138888888888889 | 0 |
| 0.7145833333333332 | 0 |
| 0.7152777777777778 | 0 |
| 0.7159722222222222 | 0 |
| 0.7166666666666667 | 0 |
| 0.717361111111111 | 0 |
| 0.7180555555555556 | 0 |
| 0.71875 | 0 |
| 0.7194444444444444 | 0 |
| 0.720138888888889 | 0 |
| 0.7208333333333333 | 0 |
| 0.7215277777777778 | 0 |
| 0.7222222222222222 | 0 |
| 0.7229166666666668 | 0 |
| 0.7236111111111111 | 0 |
| 0.7243055555555555 | 0 |
| 0.725 | 0 |
| 0.7256944444444445 | 0 |
| 0.7263888888888889 | 0 |
| 0.7270833333333333 | 0 |
| 0.7277777777777777 | 0 |
| 0.7284722222222223 | 0 |
| 0.7291666666666666 | 0 |
| 0.7298611111111111 | 0 |
| 0.7305555555555556 | 0 |
| 0.7312500000000001 | 0 |
| 0.7319444444444444 | 0 |
| 0.7326388888888888 | 0 |
| 0.7333333333333334 | 0 |
| 0.7340277777777778 | 0 |
| 0.7347222222222222 | 0 |
| 0.7354166666666666 | 0 |
| 0.7361111111111112 | 0 |
| 0.7368055555555556 | 0 |
| 0.7374999999999999 | 0 |
| 0.7381944444444444 | 0 |
| 0.7388888888888889 | 0 |
| 0.7395833333333334 | 0 |
| 0.7402777777777777 | 0 |
| 0.7409722222222223 | 0 |
| 0.7416666666666667 | 0 |
| 0.7423611111111111 | 0 |
| 0.7430555555555555 | 0 |
| 0.74375 | 0 |
| 0.7444444444444445 | 0 |
| 0.7451388888888889 | 0 |
| 0.7458333333333332 | 0 |
| 0.7465277777777778 | 0 |
| 0.7472222222222222 | 0 |
| 0.7479166666666667 | 0 |
| 0.748611111111111 | 0 |
| 0.7493055555555556 | 0 |
| 0.75 | 0 |
| 0.7506944444444444 | 0 |
| 0.751388888888889 | 0 |
| 0.7520833333333333 | 0 |
| 0.7527777777777778 | 0 |
| 0.7534722222222222 | 0 |
| 0.7541666666666668 | 0 |
| 0.7548611111111111 | 0 |
| 0.7555555555555555 | 0 |
| 0.75625 | 0 |
| 0.7569444444444445 | 0 |
| 0.7576388888888889 | 0 |
| 0.7583333333333333 | 0 |
| 0.7590277777777777 | 0 |
| 0.7597222222222223 | 0 |
| 0.7604166666666666 | 0 |
| 0.7611111111111111 | 0 |
| 0.7618055555555556 | 0 |
| 0.7625000000000001 | 0 |
| 0.7631944444444444 | 0 |
| 0.7638888888888888 | 0 |
| 0.7645833333333334 | 0 |
| 0.7652777777777778 | 0 |
| 0.7659722222222222 | 0 |
| 0.7666666666666666 | 0 |
| 0.7673611111111112 | 0 |
| 0.7680555555555556 | 0 |
| 0.7687499999999999 | 0 |
| 0.7694444444444444 | 0 |
| 0.7701388888888889 | 0 |
| 0.7708333333333334 | 0 |
| 0.7715277777777777 | 0 |
| 0.7722222222222223 | 0 |
| 0.7729166666666667 | 0 |
| 0.7736111111111111 | 0 |
| 0.7743055555555555 | 0 |
| 0.775 | 0 |
| 0.7756944444444445 | 0 |
| 0.7763888888888889 | 0 |
| 0.7770833333333332 | 0 |
| 0.7777777777777778 | 0 |
| 0.7784722222222222 | 0 |
| 0.7791666666666667 | 0 |
| 0.779861111111111 | 0 |
| 0.7805555555555556 | 0 |
| 0.78125 | 0 |
| 0.7819444444444444 | 0 |
| 0.782638888888889 | 0 |
| 0.7833333333333333 | 0 |
| 0.7840277777777778 | 0 |
| 0.7847222222222222 | 0 |
| 0.7854166666666668 | 0 |
| 0.7861111111111111 | 0 |
| 0.7868055555555555 | 0 |
| 0.7875 | 0 |
| 0.7881944444444445 | 0 |
| 0.7888888888888889 | 0 |
| 0.7895833333333333 | 0 |
| 0.7902777777777777 | 0 |
| 0.7909722222222223 | 0 |
| 0.7916666666666666 | 0 |
| 0.7923611111111111 | 0 |
| 0.7930555555555556 | 0 |
| 0.7937500000000001 | 0 |
| 0.7944444444444444 | 0 |
| 0.7951388888888888 | 0 |
| 0.7958333333333334 | 0 |
| 0.7965277777777778 | 0 |
| 0.7972222222222222 | 0 |
| 0.7979166666666666 | 0 |
| 0.7986111111111112 | 0 |
| 0.7993055555555556 | 0 |
| 0.7999999999999999 | 0 |
| 0.8006944444444444 | 0 |
| 0.8013888888888889 | 0 |
| 0.8020833333333334 | 0 |
| 0.8027777777777777 | 0 |
| 0.8034722222222223 | 0 |
| 0.8041666666666667 | 0 |
| 0.8048611111111111 | 0 |
| 0.8055555555555555 | 0 |
| 0.80625 | 0 |
| 0.8069444444444445 | 0 |
| 0.8076388888888889 | 0 |
| 0.8083333333333332 | 0 |
| 0.8090277777777778 | 0 |
| 0.8097222222222222 | 0 |
| 0.8104166666666667 | 0 |
| 0.811111111111111 | 0 |
| 0.8118055555555556 | 0 |
| 0.8125 | 0 |
| 0.8131944444444444 | 0 |
| 0.813888888888889 | 0 |
| 0.8145833333333333 | 0 |
| 0.8152777777777778 | 0 |
| 0.8159722222222222 | 0 |
| 0.8166666666666668 | 0 |
| 0.8173611111111111 | 0 |
| 0.8180555555555555 | 0 |
| 0.81875 | 0 |
| 0.8194444444444445 | 0 |
| 0.8201388888888889 | 0 |
| 0.8208333333333333 | 0 |
| 0.8215277777777777 | 0 |
| 0.8222222222222223 | 0 |
| 0.8229166666666666 | 0 |
| 0.8236111111111111 | 0 |
| 0.8243055555555556 | 0 |
| 0.8250000000000001 | 0 |
| 0.8256944444444444 | 0 |
| 0.8263888888888888 | 0 |
| 0.8270833333333334 | 0 |
| 0.8277777777777778 | 0 |
| 0.8284722222222222 | 0 |
| 0.8291666666666666 | 0 |
| 0.8298611111111112 | 0 |
| 0.8305555555555556 | 0 |
| 0.8312499999999999 | 0 |
| 0.8319444444444444 | 0 |
| 0.8326388888888889 | 0 |
| 0.8333333333333334 | 0 |
| 0.8340277777777777 | 0 |
| 0.8347222222222223 | 0 |
| 0.8354166666666667 | 0 |
| 0.8361111111111111 | 0 |
| 0.8368055555555555 | 0 |
| 0.8375 | 0 |
| 0.8381944444444445 | 0 |
| 0.8388888888888889 | 0 |
| 0.8395833333333332 | 0 |
| 0.8402777777777778 | 0 |
| 0.8409722222222222 | 0 |
| 0.8416666666666667 | 0 |
| 0.842361111111111 | 0 |
| 0.8430555555555556 | 0 |
| 0.84375 | 0 |
| 0.8444444444444444 | 0 |
| 0.845138888888889 | 0 |
| 0.8458333333333333 | 0 |
| 0.8465277777777778 | 0 |
| 0.8472222222222222 | 0 |
| 0.8479166666666668 | 0 |
| 0.8486111111111111 | 0 |
| 0.8493055555555555 | 0 |
| 0.85 | 0 |
| 0.8506944444444445 | 0 |
| 0.8513888888888889 | 0 |
| 0.8520833333333333 | 0 |
| 0.8527777777777777 | 0 |
| 0.8534722222222223 | 0 |
| 0.8541666666666666 | 0 |
| 0.8548611111111111 | 0 |
| 0.8555555555555556 | 0 |
| 0.8562500000000001 | 0 |
| 0.8569444444444444 | 0 |
| 0.8576388888888888 | 0 |
| 0.8583333333333334 | 0 |
| 0.8590277777777778 | 0 |
| 0.8597222222222222 | 0 |
| 0.8604166666666666 | 0 |
| 0.8611111111111112 | 0 |
| 0.8618055555555556 | 0 |
| 0.8624999999999999 | 0 |
| 0.8631944444444444 | 0 |
| 0.8638888888888889 | 0 |
| 0.8645833333333334 | 0 |
| 0.8652777777777777 | 0 |
| 0.8659722222222223 | 0 |
| 0.8666666666666667 | 0 |
| 0.8673611111111111 | 0 |
| 0.8680555555555555 | 0 |
| 0.86875 | 0 |
| 0.8694444444444445 | 0 |
| 0.8701388888888889 | 0 |
| 0.8708333333333332 | 0 |
| 0.8715277777777778 | 0 |
| 0.8722222222222222 | 0 |
| 0.8729166666666667 | 0 |
| 0.873611111111111 | 0 |
| 0.8743055555555556 | 0 |
| 0.875 | 0 |
| 0.8756944444444444 | 0 |
| 0.876388888888889 | 0 |
| 0.8770833333333333 | 0 |
| 0.8777777777777778 | 0 |
| 0.8784722222222222 | 0 |
| 0.8791666666666668 | 0 |
| 0.8798611111111111 | 0 |
| 0.8805555555555555 | 0 |
| 0.88125 | 0 |
| 0.8819444444444445 | 0 |
| 0.8826388888888889 | 0 |
| 0.8833333333333333 | 0 |
| 0.8840277777777777 | 0 |
| 0.8847222222222223 | 0 |
| 0.8854166666666666 | 0 |
| 0.8861111111111111 | 0 |
| 0.8868055555555556 | 0 |
| 0.8875000000000001 | 0 |
| 0.8881944444444444 | 0 |
| 0.8888888888888888 | 0 |
| 0.8895833333333334 | 0 |
| 0.8902777777777778 | 0 |
| 0.8909722222222222 | 0 |
| 0.8916666666666666 | 0 |
| 0.8923611111111112 | 0 |
| 0.8930555555555556 | 0 |
| 0.8937499999999999 | 0 |
| 0.8944444444444444 | 0 |
| 0.8951388888888889 | 0 |
| 0.8958333333333334 | 0 |
| 0.8965277777777777 | 0 |
| 0.8972222222222223 | 0 |
| 0.8979166666666667 | 0 |
| 0.8986111111111111 | 0 |
| 0.8993055555555555 | 0 |
| 0.9 | 0 |
| 0.9006944444444445 | 0 |
| 0.9013888888888889 | 0 |
| 0.9020833333333332 | 0 |
| 0.9027777777777778 | 0 |
| 0.9034722222222222 | 0 |
| 0.9041666666666667 | 0 |
| 0.904861111111111 | 0 |
| 0.9055555555555556 | 0 |
| 0.90625 | 0 |
| 0.9069444444444444 | 0 |
| 0.907638888888889 | 0 |
| 0.9083333333333333 | 0 |
| 0.9090277777777778 | 0 |
| 0.9097222222222222 | 0 |
| 0.9104166666666668 | 0 |
| 0.9111111111111111 | 0 |
| 0.9118055555555555 | 0 |
| 0.9125 | 0 |
| 0.9131944444444445 | 0 |
| 0.9138888888888889 | 0 |
| 0.9145833333333333 | 0 |
| 0.9152777777777777 | 0 |
| 0.9159722222222223 | 0 |
| 0.9166666666666666 | 0 |
| 0.9173611111111111 | 0 |
| 0.9180555555555556 | 0 |
| 0.9187500000000001 | 0 |
| 0.9194444444444444 | 0 |
| 0.9201388888888888 | 0 |
| 0.9208333333333334 | 0 |
| 0.9215277777777778 | 0 |
| 0.9222222222222222 | 0 |
| 0.9229166666666666 | 0 |
| 0.9236111111111112 | 0 |
| 0.9243055555555556 | 0 |
| 0.9249999999999999 | 0 |
| 0.9256944444444444 | 0 |
| 0.9263888888888889 | 0 |
| 0.9270833333333334 | 0 |
| 0.9277777777777777 | 0 |
| 0.9284722222222223 | 0 |
| 0.9291666666666667 | 0 |
| 0.9298611111111111 | 0 |
| 0.9305555555555555 | 0 |
| 0.93125 | 0 |
| 0.9319444444444445 | 0 |
| 0.9326388888888889 | 0 |
| 0.9333333333333332 | 0 |
| 0.9340277777777778 | 0 |
| 0.9347222222222222 | 0 |
| 0.9354166666666667 | 0 |
| 0.936111111111111 | 0 |
| 0.9368055555555556 | 0 |
| 0.9375 | 0 |
| 0.9381944444444444 | 0 |
| 0.938888888888889 | 0 |
| 0.9395833333333333 | 0 |
| 0.9402777777777778 | 0 |
| 0.9409722222222222 | 0 |
| 0.9416666666666668 | 0 |
| 0.9423611111111111 | 0 |
| 0.9430555555555555 | 0 |
| 0.94375 | 0 |
| 0.9444444444444445 | 0 |
| 0.9451388888888889 | 0 |
| 0.9458333333333333 | 0 |
| 0.9465277777777777 | 0 |
| 0.9472222222222223 | 0 |
| 0.9479166666666666 | 0 |
| 0.9486111111111111 | 0 |
| 0.9493055555555556 | 0 |
| 0.9500000000000001 | 0 |
| 0.9506944444444444 | 0 |
| 0.9513888888888888 | 0 |
| 0.9520833333333334 | 0 |
| 0.9527777777777778 | 0 |
| 0.9534722222222222 | 0 |
| 0.9541666666666666 | 0 |
| 0.9548611111111112 | 0 |
| 0.9555555555555556 | 0 |
| 0.9562499999999999 | 0 |
| 0.9569444444444444 | 0 |
| 0.9576388888888889 | 0 |
| 0.9583333333333334 | 0 |
| 0.9590277777777777 | 0 |
| 0.9597222222222223 | 0 |
| 0.9604166666666667 | 0 |
| 0.9611111111111111 | 0 |
| 0.9618055555555555 | 0 |
| 0.9625 | 0 |
| 0.9631944444444445 | 0 |
| 0.9638888888888889 | 0 |
| 0.9645833333333332 | 0 |
| 0.9652777777777778 | 0 |
| 0.9659722222222222 | 0 |
| 0.9666666666666667 | 0 |
| 0.967361111111111 | 0 |
| 0.9680555555555556 | 0 |
| 0.96875 | 0 |
| 0.9694444444444444 | 0 |
| 0.970138888888889 | 0 |
| 0.9708333333333333 | 0 |
| 0.9715277777777778 | 0 |
| 0.9722222222222222 | 0 |
| 0.9729166666666668 | 0 |
| 0.9736111111111111 | 0 |
| 0.9743055555555555 | 0 |
| 0.975 | 0 |
| 0.9756944444444445 | 0 |
| 0.9763888888888889 | 0 |
| 0.9770833333333333 | 0 |
| 0.9777777777777777 | 0 |
| 0.9784722222222223 | 0 |
| 0.9791666666666666 | 0 |
| 0.9798611111111111 | 0 |
| 0.9805555555555556 | 0 |
| 0.9812500000000001 | 0 |
| 0.9819444444444444 | 0 |
| 0.9826388888888888 | 0 |
| 0.9833333333333334 | 0 |
| 0.9840277777777778 | 0 |
| 0.9847222222222222 | 0 |
| 0.9854166666666666 | 0 |
| 0.9861111111111112 | 0 |
| 0.9868055555555556 | 0 |
| 0.9874999999999999 | 0 |
| 0.9881944444444444 | 0 |
| 0.9888888888888889 | 0 |
| 0.9895833333333334 | 0 |
| 0.9902777777777777 | 0 |
| 0.9909722222222223 | 0 |
| 0.9916666666666667 | 0 |
| 0.9923611111111111 | 0 |
| 0.9930555555555555 | 0 |
| 0.99375 | 0 |
| 0.9944444444444445 | 0 |
| 0.9951388888888889 | 0 |
| 0.9958333333333332 | 0 |
| 0.9965277777777778 | 0 |
| 0.9972222222222222 | 0 |
| 0.9979166666666667 | 0 |
| 0.998611111111111 | 0 |
| 0.9993055555555556 | 0 |